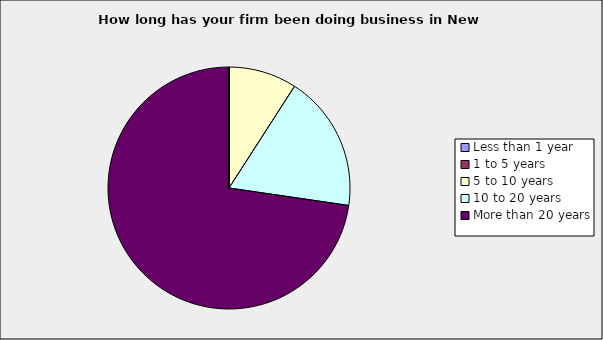
| Category | Series 0 |
|---|---|
| Less than 1 year | 0 |
| 1 to 5 years | 0 |
| 5 to 10 years | 0.091 |
| 10 to 20 years | 0.182 |
| More than 20 years | 0.727 |